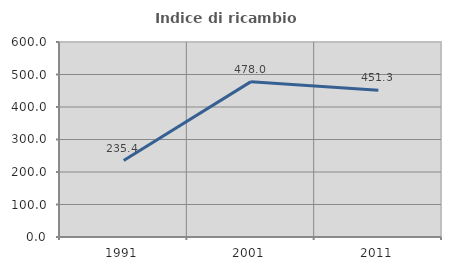
| Category | Indice di ricambio occupazionale  |
|---|---|
| 1991.0 | 235.385 |
| 2001.0 | 478.049 |
| 2011.0 | 451.282 |